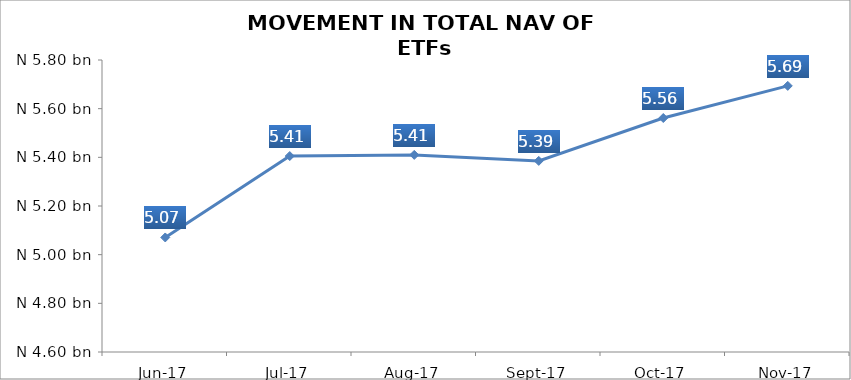
| Category | Series 0 |
|---|---|
| 2017-06-01 | 5070730900.48 |
| 2017-07-01 | 5405312682.53 |
| 2017-08-01 | 5410071931.29 |
| 2017-09-01 | 5385378575.54 |
| 2017-10-01 | 5561634501.26 |
| 2017-11-01 | 5693600846.84 |